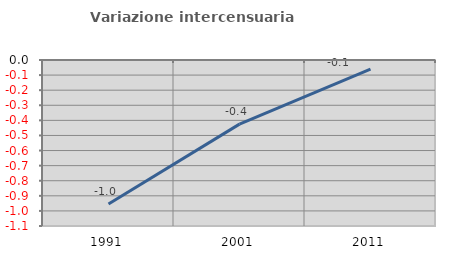
| Category | Variazione intercensuaria annua |
|---|---|
| 1991.0 | -0.954 |
| 2001.0 | -0.425 |
| 2011.0 | -0.061 |